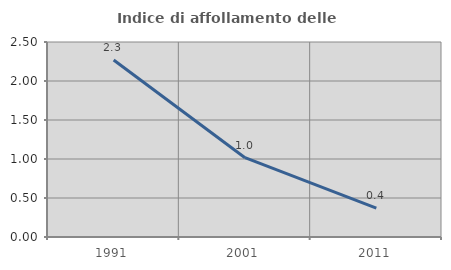
| Category | Indice di affollamento delle abitazioni  |
|---|---|
| 1991.0 | 2.269 |
| 2001.0 | 1.017 |
| 2011.0 | 0.37 |